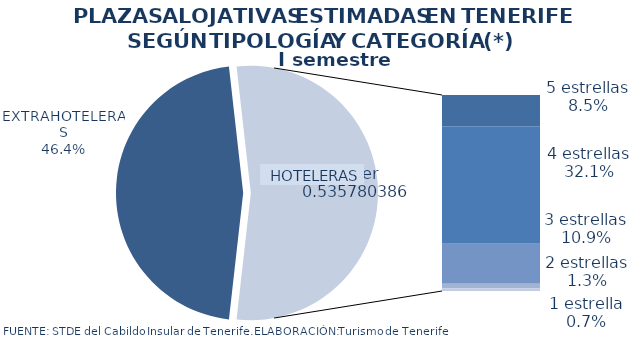
| Category | I semestre 2013 |
|---|---|
| EXTRAHOTELERAS | 0.464 |
| 5 estrellas | 0.085 |
| 4 estrellas | 0.321 |
| 3 estrellas | 0.109 |
| 2 estrellas | 0.013 |
| 1 estrella | 0.007 |